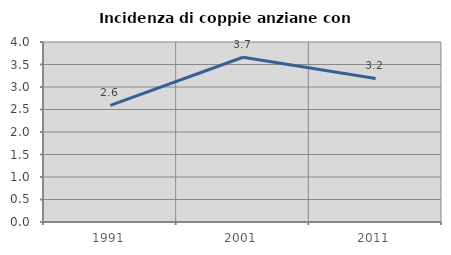
| Category | Incidenza di coppie anziane con figli |
|---|---|
| 1991.0 | 2.591 |
| 2001.0 | 3.661 |
| 2011.0 | 3.189 |